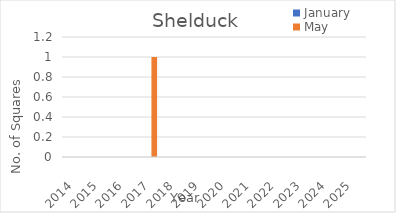
| Category | January | May |
|---|---|---|
| 2014.0 | 0 | 0 |
| 2015.0 | 0 | 0 |
| 2016.0 | 0 | 0 |
| 2017.0 | 0 | 1 |
| 2018.0 | 0 | 0 |
| 2019.0 | 0 | 0 |
| 2020.0 | 0 | 0 |
| 2021.0 | 0 | 0 |
| 2022.0 | 0 | 0 |
| 2023.0 | 0 | 0 |
| 2024.0 | 0 | 0 |
| 2025.0 | 0 | 0 |